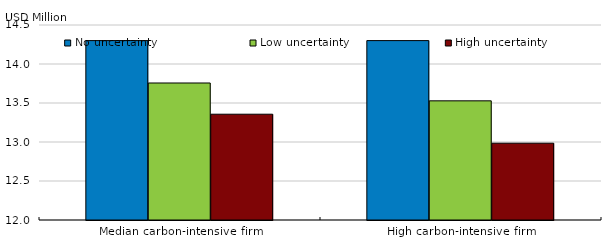
| Category | No uncertainty | Low uncertainty  | High uncertainty |
|---|---|---|---|
| Median carbon-intensive firm | 14.3 | 13.757 | 13.356 |
| High carbon-intensive firm | 14.3 | 13.528 | 12.984 |